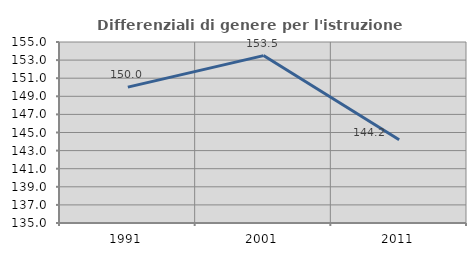
| Category | Differenziali di genere per l'istruzione superiore |
|---|---|
| 1991.0 | 150.011 |
| 2001.0 | 153.498 |
| 2011.0 | 144.195 |